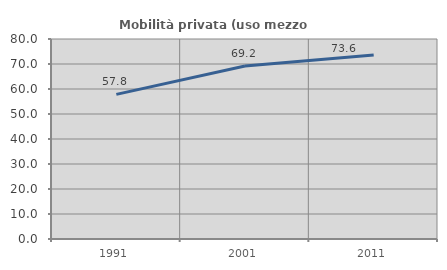
| Category | Mobilità privata (uso mezzo privato) |
|---|---|
| 1991.0 | 57.839 |
| 2001.0 | 69.211 |
| 2011.0 | 73.573 |